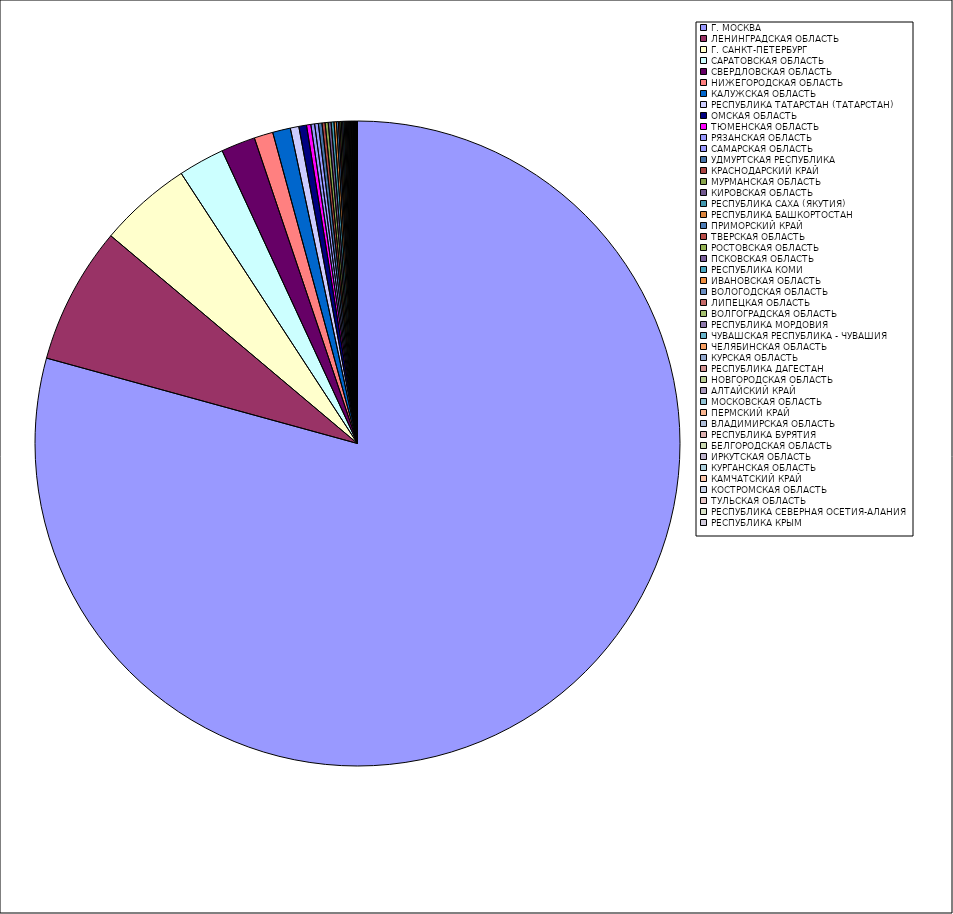
| Category | Оборот |
|---|---|
| Г. МОСКВА | 79.251 |
| ЛЕНИНГРАДСКАЯ ОБЛАСТЬ | 6.871 |
| Г. САНКТ-ПЕТЕРБУРГ | 4.657 |
| САРАТОВСКАЯ ОБЛАСТЬ | 2.31 |
| СВЕРДЛОВСКАЯ ОБЛАСТЬ | 1.713 |
| НИЖЕГОРОДСКАЯ ОБЛАСТЬ | 0.944 |
| КАЛУЖСКАЯ ОБЛАСТЬ | 0.893 |
| РЕСПУБЛИКА ТАТАРСТАН (ТАТАРСТАН) | 0.428 |
| ОМСКАЯ ОБЛАСТЬ | 0.385 |
| ТЮМЕНСКАЯ ОБЛАСТЬ | 0.217 |
| РЯЗАНСКАЯ ОБЛАСТЬ | 0.188 |
| САМАРСКАЯ ОБЛАСТЬ | 0.184 |
| УДМУРТСКАЯ РЕСПУБЛИКА | 0.183 |
| КРАСНОДАРСКИЙ КРАЙ | 0.155 |
| МУРМАНСКАЯ ОБЛАСТЬ | 0.154 |
| КИРОВСКАЯ ОБЛАСТЬ | 0.144 |
| РЕСПУБЛИКА САХА (ЯКУТИЯ) | 0.143 |
| РЕСПУБЛИКА БАШКОРТОСТАН | 0.118 |
| ПРИМОРСКИЙ КРАЙ | 0.095 |
| ТВЕРСКАЯ ОБЛАСТЬ | 0.074 |
| РОСТОВСКАЯ ОБЛАСТЬ | 0.074 |
| ПСКОВСКАЯ ОБЛАСТЬ | 0.069 |
| РЕСПУБЛИКА КОМИ | 0.066 |
| ИВАНОВСКАЯ ОБЛАСТЬ | 0.055 |
| ВОЛОГОДСКАЯ ОБЛАСТЬ | 0.052 |
| ЛИПЕЦКАЯ ОБЛАСТЬ | 0.048 |
| ВОЛГОГРАДСКАЯ ОБЛАСТЬ | 0.047 |
| РЕСПУБЛИКА МОРДОВИЯ | 0.041 |
| ЧУВАШСКАЯ РЕСПУБЛИКА - ЧУВАШИЯ | 0.039 |
| ЧЕЛЯБИНСКАЯ ОБЛАСТЬ | 0.039 |
| КУРСКАЯ ОБЛАСТЬ | 0.037 |
| РЕСПУБЛИКА ДАГЕСТАН | 0.037 |
| НОВГОРОДСКАЯ ОБЛАСТЬ | 0.033 |
| АЛТАЙСКИЙ КРАЙ | 0.033 |
| МОСКОВСКАЯ ОБЛАСТЬ | 0.029 |
| ПЕРМСКИЙ КРАЙ | 0.028 |
| ВЛАДИМИРСКАЯ ОБЛАСТЬ | 0.025 |
| РЕСПУБЛИКА БУРЯТИЯ | 0.022 |
| БЕЛГОРОДСКАЯ ОБЛАСТЬ | 0.021 |
| ИРКУТСКАЯ ОБЛАСТЬ | 0.02 |
| КУРГАНСКАЯ ОБЛАСТЬ | 0.014 |
| КАМЧАТСКИЙ КРАЙ | 0.014 |
| КОСТРОМСКАЯ ОБЛАСТЬ | 0.009 |
| ТУЛЬСКАЯ ОБЛАСТЬ | 0.008 |
| РЕСПУБЛИКА СЕВЕРНАЯ ОСЕТИЯ-АЛАНИЯ | 0.007 |
| РЕСПУБЛИКА КРЫМ | 0.007 |